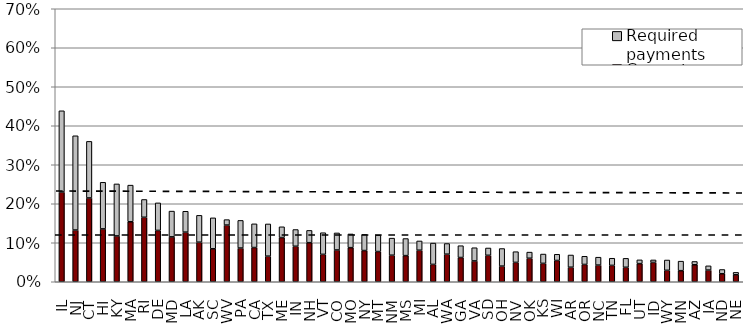
| Category | Current payments | Required payments |
|---|---|---|
| IL | 0.23 | 0.208 |
| NJ | 0.133 | 0.242 |
| CT | 0.215 | 0.145 |
| HI | 0.135 | 0.12 |
| KY | 0.118 | 0.133 |
| MA | 0.154 | 0.094 |
| RI | 0.165 | 0.046 |
| DE | 0.132 | 0.071 |
| MD | 0.115 | 0.066 |
| LA | 0.127 | 0.054 |
| AK | 0.101 | 0.069 |
| SC | 0.085 | 0.079 |
| WV | 0.145 | 0.014 |
| PA | 0.086 | 0.071 |
| CA | 0.088 | 0.061 |
| TX | 0.066 | 0.083 |
| ME | 0.113 | 0.028 |
| IN | 0.091 | 0.043 |
| NH | 0.1 | 0.031 |
| VT | 0.07 | 0.055 |
| CO | 0.081 | 0.044 |
| MO | 0.087 | 0.035 |
| NY | 0.08 | 0.041 |
| MT | 0.077 | 0.042 |
| NM | 0.068 | 0.044 |
| MS | 0.067 | 0.044 |
| MI | 0.081 | 0.024 |
| AL | 0.044 | 0.055 |
| WA | 0.071 | 0.027 |
| GA | 0.062 | 0.03 |
| VA | 0.053 | 0.034 |
| SD | 0.068 | 0.019 |
| OH | 0.04 | 0.045 |
| NV | 0.05 | 0.027 |
| OK | 0.06 | 0.016 |
| KS | 0.047 | 0.024 |
| WI | 0.055 | 0.016 |
| AR | 0.037 | 0.031 |
| OR | 0.044 | 0.021 |
| NC | 0.043 | 0.02 |
| TN | 0.042 | 0.018 |
| FL | 0.037 | 0.023 |
| UT | 0.046 | 0.01 |
| ID | 0.05 | 0.006 |
| WY | 0.029 | 0.026 |
| MN | 0.028 | 0.024 |
| AZ | 0.044 | 0.008 |
| IA | 0.03 | 0.011 |
| ND | 0.021 | 0.011 |
| NE | 0.018 | 0.006 |